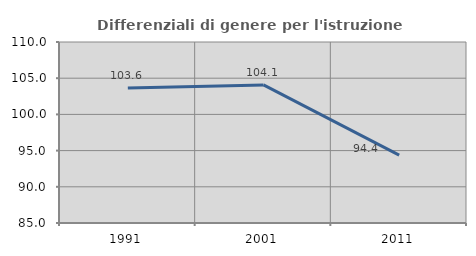
| Category | Differenziali di genere per l'istruzione superiore |
|---|---|
| 1991.0 | 103.633 |
| 2001.0 | 104.078 |
| 2011.0 | 94.376 |